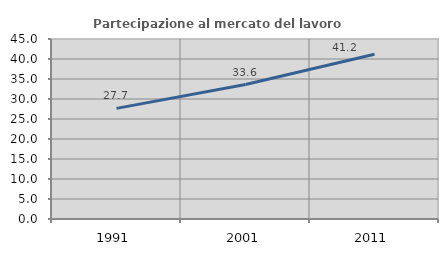
| Category | Partecipazione al mercato del lavoro  femminile |
|---|---|
| 1991.0 | 27.66 |
| 2001.0 | 33.615 |
| 2011.0 | 41.176 |